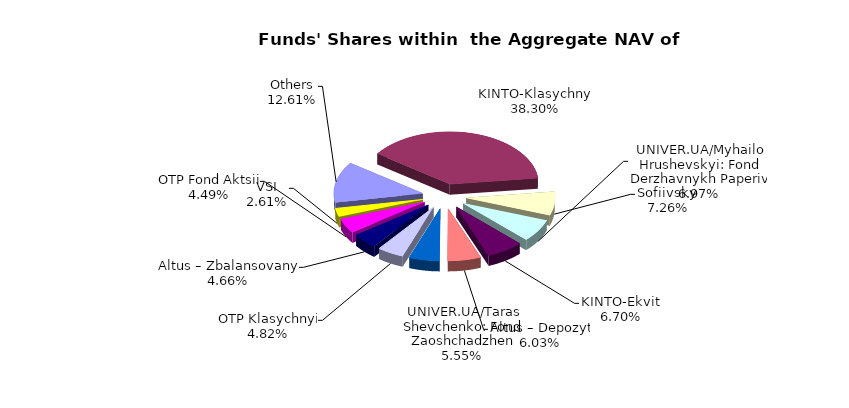
| Category | Series 0 | Series 1 |
|---|---|---|
| Others | 7577094.53 | 0.126 |
| KINTO-Klasychnyi | 23005288.93 | 0.383 |
| Sofiivskyi | 4362588.782 | 0.073 |
| UNIVER.UA/Myhailo Hrushevskyi: Fond Derzhavnykh Paperiv | 4186409.89 | 0.07 |
| KINTO-Ekviti | 4024078.71 | 0.067 |
| Altus – Depozyt | 3624061.63 | 0.06 |
| UNIVER.UA/Taras Shevchenko: Fond Zaoshchadzhen | 3332050.94 | 0.055 |
| ОТP Klasychnyi | 2895946 | 0.048 |
| Altus – Zbalansovanyi | 2796415.69 | 0.047 |
| OTP Fond Aktsii | 2694388.55 | 0.045 |
| VSI | 1568243.84 | 0.026 |